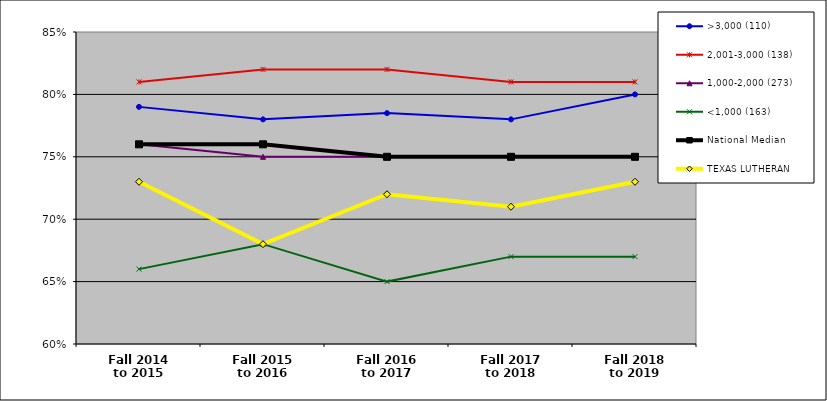
| Category | >3,000 (110) | 2,001-3,000 (138) | 1,000-2,000 (273) | <1,000 (163) | National Median | TEXAS LUTHERAN |
|---|---|---|---|---|---|---|
| Fall 2014
to 2015 | 0.79 | 0.81 | 0.76 | 0.66 | 0.76 | 0.73 |
| Fall 2015
to 2016 | 0.78 | 0.82 | 0.75 | 0.68 | 0.76 | 0.68 |
| Fall 2016
to 2017 | 0.785 | 0.82 | 0.75 | 0.65 | 0.75 | 0.72 |
| Fall 2017
to 2018 | 0.78 | 0.81 | 0.75 | 0.67 | 0.75 | 0.71 |
| Fall 2018
to 2019 | 0.8 | 0.81 | 0.75 | 0.67 | 0.75 | 0.73 |